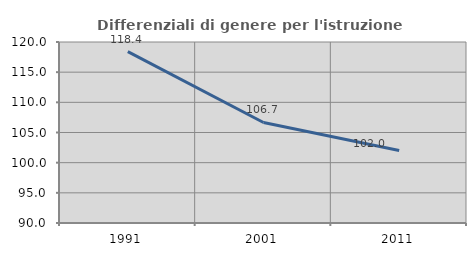
| Category | Differenziali di genere per l'istruzione superiore |
|---|---|
| 1991.0 | 118.411 |
| 2001.0 | 106.658 |
| 2011.0 | 102.017 |